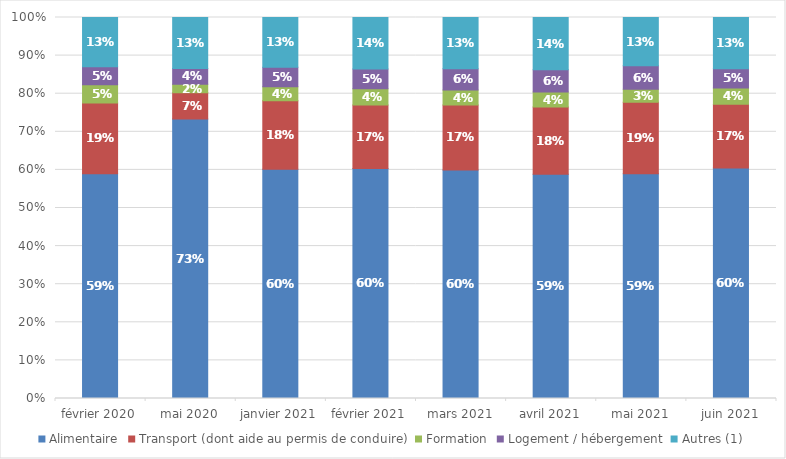
| Category | Alimentaire | Transport (dont aide au permis de conduire) | Formation | Logement / hébergement | Autres (1) |
|---|---|---|---|---|---|
| février 2020 | 0.59 | 0.186 | 0.048 | 0.047 | 0.129 |
| mai 2020 | 0.734 | 0.069 | 0.023 | 0.041 | 0.134 |
| janvier 2021 | 0.602 | 0.18 | 0.037 | 0.051 | 0.131 |
| février 2021 | 0.604 | 0.167 | 0.043 | 0.052 | 0.135 |
| mars 2021 | 0.6 | 0.171 | 0.039 | 0.056 | 0.134 |
| avril 2021 | 0.588 | 0.177 | 0.039 | 0.059 | 0.137 |
| mai 2021 | 0.59 | 0.187 | 0.034 | 0.061 | 0.127 |
| juin 2021 | 0.605 | 0.168 | 0.043 | 0.05 | 0.135 |